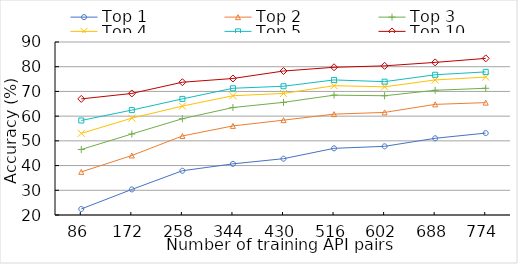
| Category | Top 1 | Top 2 | Top 3 | Top 4 | Top 5 | Top 10 |
|---|---|---|---|---|---|---|
| 86.0 | 22.442 | 37.442 | 46.512 | 53.023 | 58.256 | 66.977 |
| 172.0 | 30.349 | 44.07 | 52.791 | 59.186 | 62.442 | 69.186 |
| 258.0 | 37.907 | 51.977 | 58.953 | 64.07 | 66.977 | 73.721 |
| 344.0 | 40.698 | 56.047 | 63.488 | 68.256 | 71.279 | 75.233 |
| 430.0 | 42.791 | 58.372 | 65.581 | 69.186 | 72.093 | 78.256 |
| 516.0 | 46.977 | 60.814 | 68.488 | 72.326 | 74.651 | 79.767 |
| 602.0 | 47.791 | 61.512 | 68.256 | 71.86 | 73.953 | 80.349 |
| 688.0 | 51.047 | 64.767 | 70.465 | 74.651 | 76.744 | 81.744 |
| 774.0 | 53.14 | 65.465 | 71.279 | 75.814 | 77.907 | 83.372 |